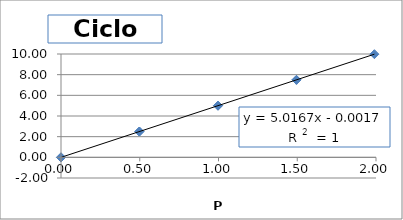
| Category | Output (V) |
|---|---|
| 0.0 | 0 |
| 0.49760000000000004 | 2.498 |
| 0.9968 | 4.998 |
| 1.495 | 7.498 |
| 1.9898000000000002 | 9.982 |
| 1.495 | 7.498 |
| 0.9968 | 4.997 |
| 0.49760000000000004 | 2.491 |
| 0.0 | -0.002 |